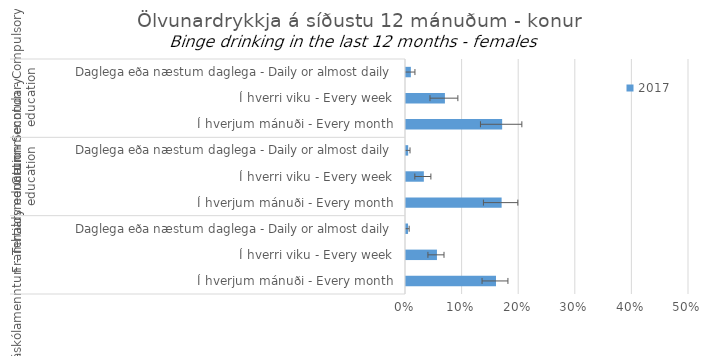
| Category | 2017 |
|---|---|
| 0 | 0.009 |
| 1 | 0.069 |
| 2 | 0.17 |
| 3 | 0.004 |
| 4 | 0.032 |
| 5 | 0.169 |
| 6 | 0.004 |
| 7 | 0.055 |
| 8 | 0.159 |